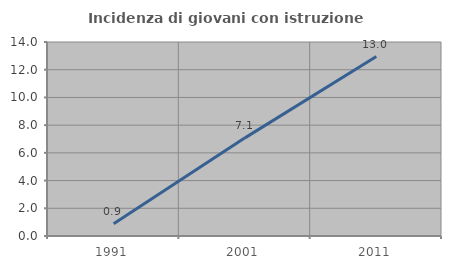
| Category | Incidenza di giovani con istruzione universitaria |
|---|---|
| 1991.0 | 0.877 |
| 2001.0 | 7.082 |
| 2011.0 | 12.953 |